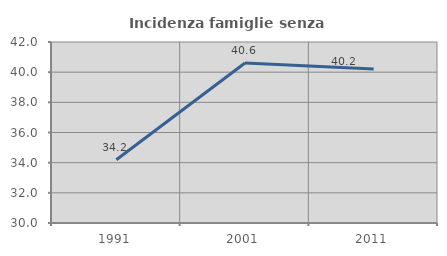
| Category | Incidenza famiglie senza nuclei |
|---|---|
| 1991.0 | 34.194 |
| 2001.0 | 40.608 |
| 2011.0 | 40.214 |